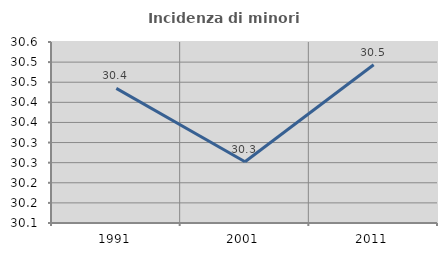
| Category | Incidenza di minori stranieri |
|---|---|
| 1991.0 | 30.435 |
| 2001.0 | 30.252 |
| 2011.0 | 30.493 |